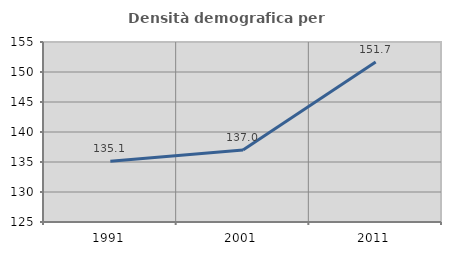
| Category | Densità demografica |
|---|---|
| 1991.0 | 135.125 |
| 2001.0 | 136.994 |
| 2011.0 | 151.657 |